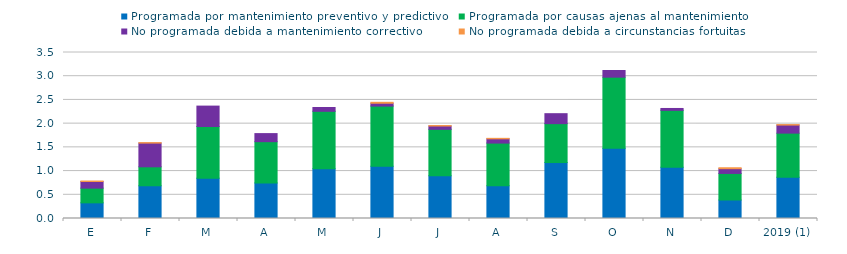
| Category | Programada por mantenimiento preventivo y predictivo | Programada por causas ajenas al mantenimiento  | No programada debida a mantenimiento correctivo  | No programada debida a circunstancias fortuitas  |
|---|---|---|---|---|
| E | 0.33 | 0.31 | 0.14 | 0.01 |
| F | 0.69 | 0.4 | 0.5 | 0.01 |
| M | 0.85 | 1.09 | 0.43 | 0 |
| A | 0.75 | 0.87 | 0.17 | 0 |
| M | 1.05 | 1.21 | 0.08 | 0 |
| J | 1.1 | 1.27 | 0.06 | 0.02 |
| J | 0.9 | 0.98 | 0.07 | 0.01 |
| A | 0.69 | 0.9 | 0.09 | 0.01 |
| S | 1.18 | 0.82 | 0.21 | 0 |
| O | 1.48 | 1.5 | 0.14 | 0 |
| N | 1.08 | 1.2 | 0.04 | 0 |
| D | 0.39 | 0.56 | 0.1 | 0.02 |
| 2019 (1) | 0.87 | 0.93 | 0.17 | 0.01 |